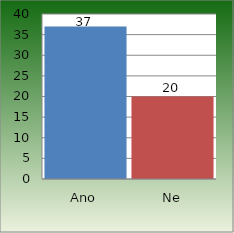
| Category | Series 0 |
|---|---|
| Ano | 37 |
| Ne | 20 |